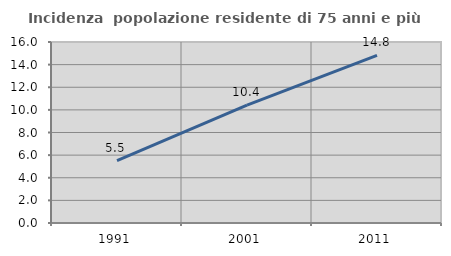
| Category | Incidenza  popolazione residente di 75 anni e più |
|---|---|
| 1991.0 | 5.505 |
| 2001.0 | 10.426 |
| 2011.0 | 14.809 |